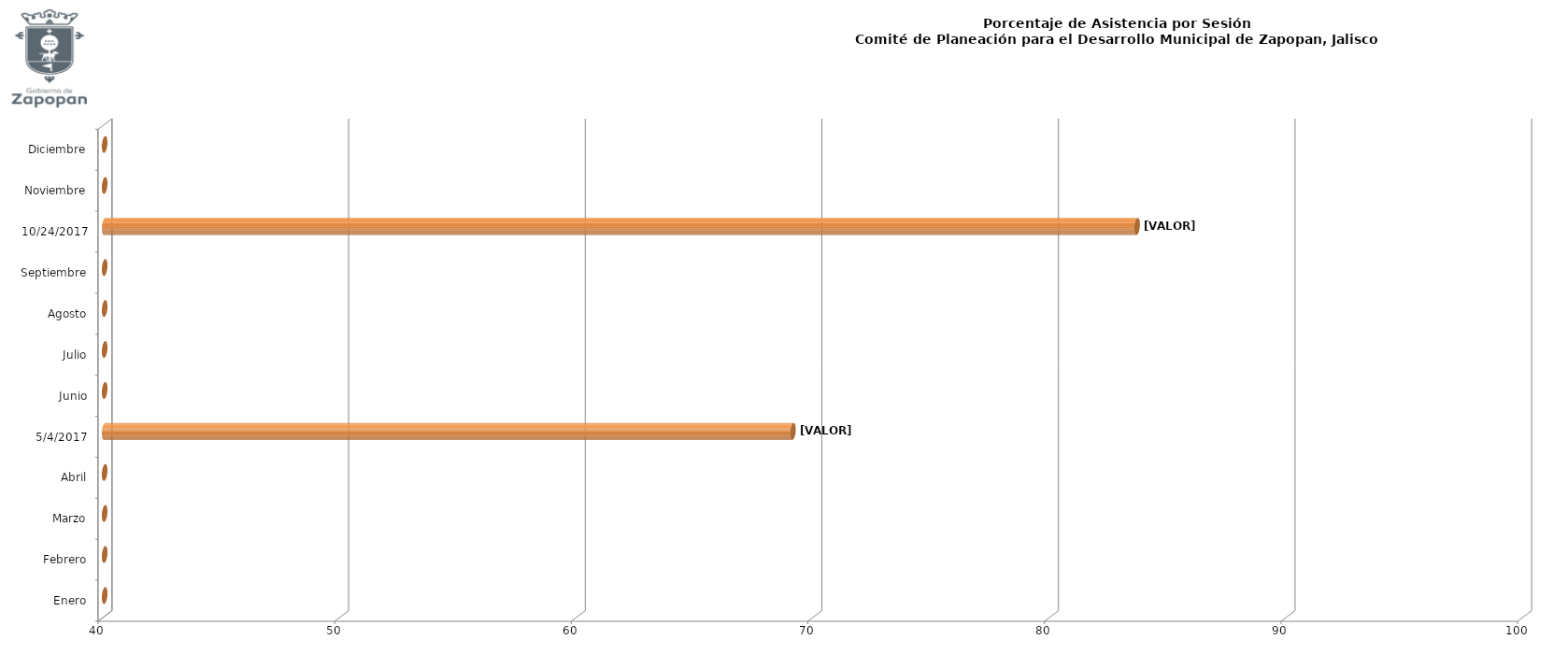
| Category | Series 0 |
|---|---|
| Enero | 0 |
| Febrero | 0 |
| Marzo | 0 |
| Abril | 0 |
| 04/05/2017 | 69.091 |
| Junio | 0 |
| Julio | 0 |
| Agosto | 0 |
| Septiembre | 0 |
| 24/10/2017 | 83.636 |
| Noviembre | 0 |
| Diciembre | 0 |